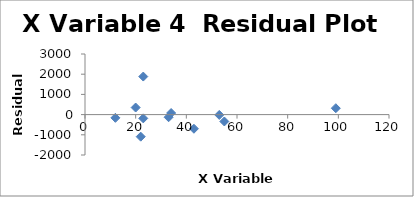
| Category | Series 0 |
|---|---|
| 20.0 | 349.35 |
| 12.0 | -160.299 |
| 33.0 | -130.233 |
| 43.0 | -700.219 |
| 53.0 | -17.042 |
| 23.0 | -186.234 |
| 99.0 | 316.18 |
| 34.0 | 78.407 |
| 23.0 | 1883.068 |
| 55.0 | -340.074 |
| 22.0 | -1092.905 |